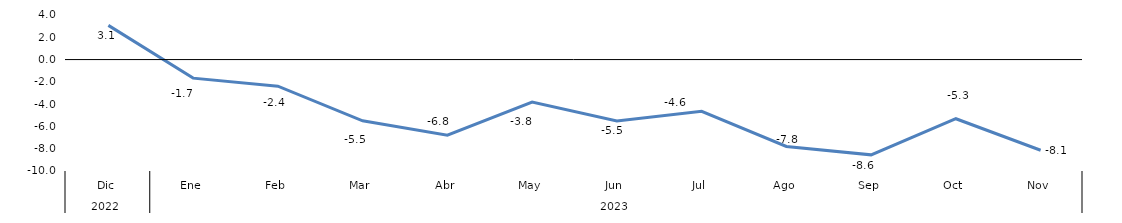
| Category | Series 0 |
|---|---|
| 0 | 3.067 |
| 1 | -1.667 |
| 2 | -2.385 |
| 3 | -5.499 |
| 4 | -6.782 |
| 5 | -3.813 |
| 6 | -5.504 |
| 7 | -4.641 |
| 8 | -7.799 |
| 9 | -8.551 |
| 10 | -5.309 |
| 11 | -8.138 |